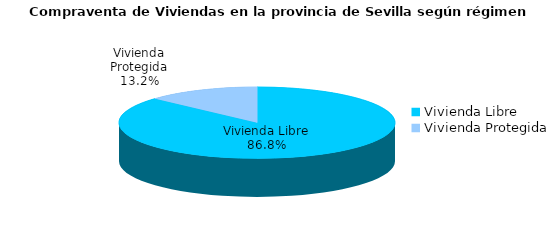
| Category | Series 0 | Series 1 |
|---|---|---|
| Vivienda Libre | 1187 | 0.868 |
| Vivienda Protegida | 181 | 0.132 |